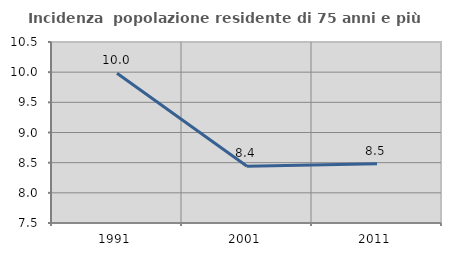
| Category | Incidenza  popolazione residente di 75 anni e più |
|---|---|
| 1991.0 | 9.982 |
| 2001.0 | 8.442 |
| 2011.0 | 8.483 |